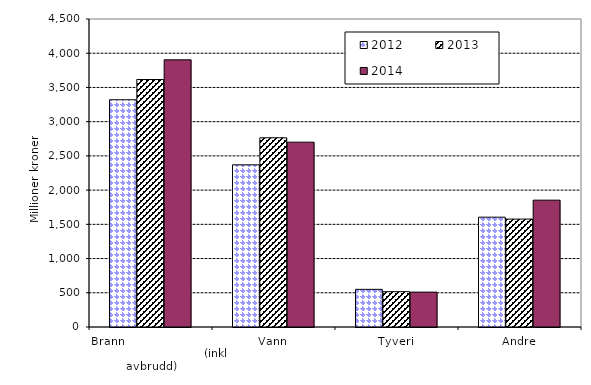
| Category | 2012 | 2013 | 2014 |
|---|---|---|---|
| Brann                                                       (inkl avbrudd) | 3320.172 | 3616.044 | 3903.557 |
| Vann | 2369.36 | 2764.131 | 2700.231 |
| Tyveri | 549.974 | 516.064 | 509.516 |
| Andre | 1604.547 | 1576.574 | 1853.071 |